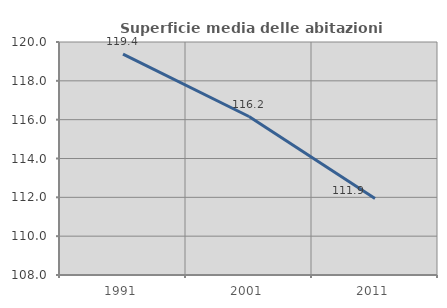
| Category | Superficie media delle abitazioni occupate |
|---|---|
| 1991.0 | 119.377 |
| 2001.0 | 116.162 |
| 2011.0 | 111.944 |